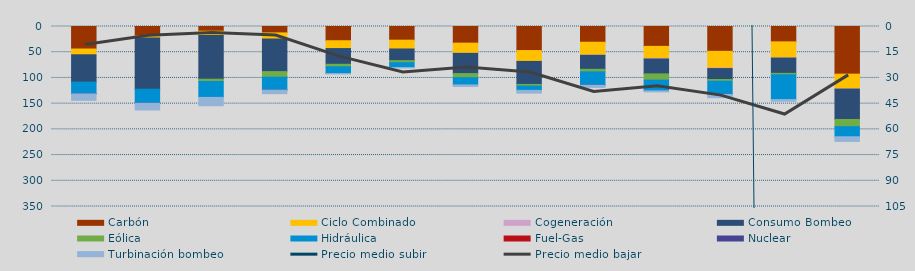
| Category | Carbón | Ciclo Combinado | Cogeneración | Consumo Bombeo | Eólica | Hidráulica | Fuel-Gas | Nuclear | Turbinación bombeo |
|---|---|---|---|---|---|---|---|---|---|
| F | 43794.4 | 11177.4 | 0 | 53203.2 | 0 | 22399 | 0 | 424.5 | 12599.6 |
| M | 18462.8 | 3751.2 | 0 | 99732.8 | 0 | 27305.6 | 0 | 8.3 | 13117.3 |
| A | 9128.2 | 8591.4 | 0 | 84739.1 | 4519.6 | 30920 | 0 | 0 | 16195.4 |
| M | 12444.9 | 11889.1 | 0 | 63369.7 | 10841.6 | 24843.5 | 0 | 260 | 6935.7 |
| J | 27670.2 | 15256.9 | 0 | 30546.6 | 4860.6 | 13133.6 | 0 | 35 | 583.9 |
| J | 26575.7 | 17125.2 | 0 | 22647.3 | 4001.3 | 9478.8 | 0 | 0 | 608.4 |
| A | 32372.1 | 19882 | 0.8 | 39268.2 | 8039.4 | 14094.1 | 0 | 0 | 2953 |
| S | 46810.1 | 21088.9 | 0 | 44806.4 | 3126.2 | 8427.2 | 0 | 0 | 5288 |
| O | 30606.2 | 25077.2 | 351.5 | 27192.1 | 4972 | 25903.4 | 0 | 171.9 | 4234.4 |
| N | 38654 | 23471.9 | 1088.5 | 28952.2 | 12138.1 | 20858.9 | 0 | 0 | 1910.4 |
| D | 48332.5 | 32343 | 1137.1 | 21197.2 | 3426.7 | 25403.7 | 0 | 222 | 6361.9 |
| E | 29873.4 | 31257.5 | 232.7 | 29718.6 | 2813.5 | 48230.3 | 0 | 0 | 3337.1 |
| F | 92635.5 | 28594.2 | 463.1 | 59071.9 | 13978.3 | 19654.8 | 0 | 0 | 9063.5 |